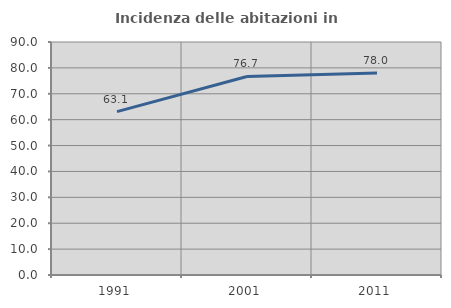
| Category | Incidenza delle abitazioni in proprietà  |
|---|---|
| 1991.0 | 63.093 |
| 2001.0 | 76.684 |
| 2011.0 | 78 |